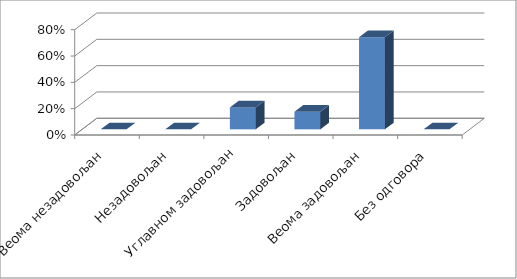
| Category | Series 0 |
|---|---|
| Веома незадовољан | 0 |
| Незадовољан | 0 |
| Углавном задовољан | 0.167 |
| Задовољан | 0.133 |
| Веома задовољан | 0.7 |
| Без одговора | 0 |